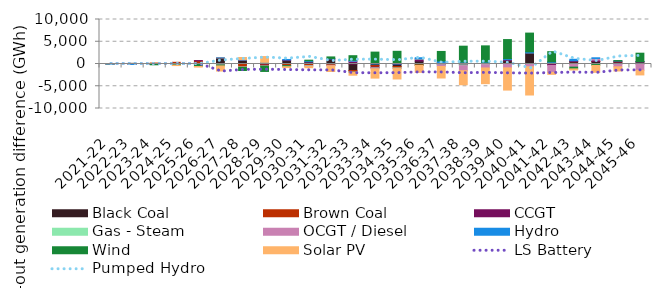
| Category | Black Coal | Brown Coal | CCGT | Gas - Steam | OCGT / Diesel | Hydro | Wind | Solar PV |
|---|---|---|---|---|---|---|---|---|
| 2021-22 | -17.251 | 72.637 | -26.947 | -0.017 | -0.849 | -0.001 | 0.14 | 1.508 |
| 2022-23 | -103.973 | 123.124 | 0.003 | 0 | -0.044 | -0.018 | 0.522 | 0.764 |
| 2023-24 | -68.506 | 214.563 | -4.619 | -0.023 | -0.662 | -0.351 | -101.957 | 5.244 |
| 2024-25 | -45.17 | 380.501 | -4.883 | -0.752 | -3.147 | -7.73 | -167.855 | -120.061 |
| 2025-26 | 323.298 | 391.919 | 48.309 | -10.332 | -5.885 | -1.983 | -542.575 | -128.103 |
| 2026-27 | 1242.132 | 97.922 | -146.107 | -37.499 | -39.064 | 32.497 | -198.004 | -1158.002 |
| 2027-28 | 801.409 | -659.798 | 68.151 | -45.679 | -67.947 | 95.384 | -686.84 | 494.232 |
| 2028-29 | -104.015 | -337.052 | 188.592 | -5.571 | -51.237 | 186.734 | -1174.216 | 1298.19 |
| 2029-30 | 752.416 | -334.907 | 157.51 | -2.332 | -32.421 | 110.185 | -223.862 | -215.836 |
| 2030-31 | 407.953 | -364.135 | 103.795 | -87.239 | -118.274 | 200.34 | 147.092 | -267.667 |
| 2031-32 | 1137.749 | -293.522 | -6.524 | -22.213 | -94.62 | 107.604 | 346.402 | -1266.445 |
| 2032-33 | -1458.222 | -351.506 | 602.699 | -81.923 | 37.32 | 198.123 | 1029.793 | -627.564 |
| 2033-34 | -356.227 | -360.123 | -143.239 | -38.088 | -184.292 | 111.029 | 2560.508 | -2089.37 |
| 2034-35 | -557.841 | -324.932 | 0.599 | -86.322 | -65.037 | 116.443 | 2735.476 | -2332.423 |
| 2035-36 | 652.982 | -245.621 | 439.831 | 66.428 | 12.683 | 239.214 | -81.309 | -1546.413 |
| 2036-37 | 271.529 | 0.09 | -182.948 | -22.335 | -361.244 | 403.05 | 2145.141 | -2579.536 |
| 2037-38 | 281.153 | 0.086 | -198.715 | -180.717 | -1134.066 | 149.433 | 3574.462 | -3152.361 |
| 2038-39 | 299.912 | 0.094 | -54.75 | -97.605 | -739.086 | 137.221 | 3640.475 | -3521.499 |
| 2039-40 | 746.148 | 0.098 | 209.463 | 0 | -869.846 | 249.155 | 4286.49 | -4990.208 |
| 2040-41 | 2446.564 | 0.093 | -37.939 | 0 | -584.932 | 288.999 | 4209.118 | -6344.944 |
| 2041-42 | 347.687 | 0.092 | -329.299 | 0 | -1551.366 | 151.744 | 2274.448 | -445.096 |
| 2042-43 | 512.742 | 0.103 | 213.164 | 0 | -706.088 | 331.959 | -391.443 | -250.383 |
| 2043-44 | 577.372 | 0.098 | 305.85 | 0 | 361.465 | 151.908 | -321.727 | -1542.306 |
| 2044-45 | 455.24 | 0.093 | 220.445 | 0 | -636.98 | 5.36 | 80.605 | -931.24 |
| 2045-46 | 506.068 | 0.024 | 4.674 | 0 | -1405.167 | 38.959 | 1878.041 | -1048.524 |